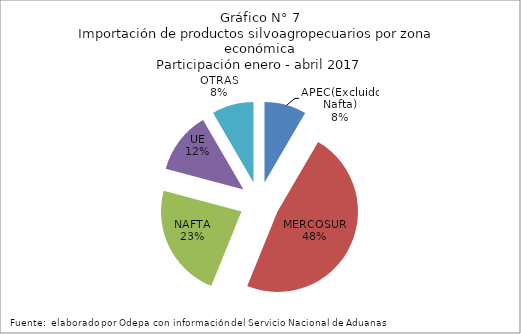
| Category | Series 0 |
|---|---|
| APEC(Excluido Nafta) | 150410.971 |
| MERCOSUR | 852309.871 |
| NAFTA | 411192.997 |
| UE | 222850.914 |
| OTRAS | 149596.248 |